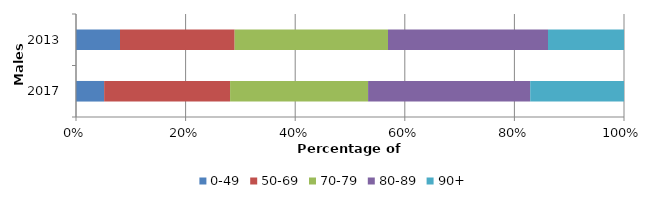
| Category | 0-49 | 50-69 | 70-79 | 80-89 | 90+ |
|---|---|---|---|---|---|
| 2017.0 | 21 | 94 | 103 | 121 | 70 |
| 2013.0 | 33 | 86 | 115 | 120 | 57 |